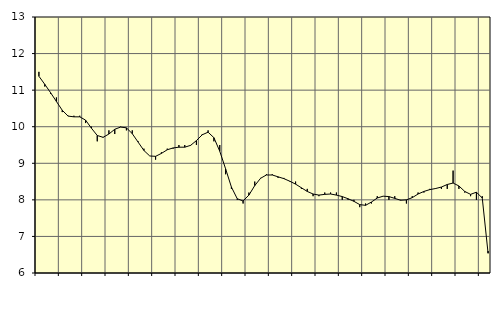
| Category | Piggar | Tillverkning av verkstadsvaror, SNI 25-30, 33 |
|---|---|---|
| nan | 11.5 | 11.38 |
| 1.0 | 11.1 | 11.16 |
| 1.0 | 10.9 | 10.93 |
| 1.0 | 10.8 | 10.69 |
| nan | 10.4 | 10.45 |
| 2.0 | 10.3 | 10.29 |
| 2.0 | 10.3 | 10.27 |
| 2.0 | 10.3 | 10.27 |
| nan | 10.1 | 10.18 |
| 3.0 | 10 | 9.96 |
| 3.0 | 9.6 | 9.76 |
| 3.0 | 9.7 | 9.71 |
| nan | 9.9 | 9.8 |
| 4.0 | 9.8 | 9.93 |
| 4.0 | 10 | 9.99 |
| 4.0 | 9.9 | 9.97 |
| nan | 9.9 | 9.81 |
| 5.0 | 9.6 | 9.58 |
| 5.0 | 9.4 | 9.35 |
| 5.0 | 9.2 | 9.2 |
| nan | 9.1 | 9.19 |
| 6.0 | 9.3 | 9.27 |
| 6.0 | 9.4 | 9.37 |
| 6.0 | 9.4 | 9.42 |
| nan | 9.5 | 9.44 |
| 7.0 | 9.5 | 9.44 |
| 7.0 | 9.5 | 9.49 |
| 7.0 | 9.5 | 9.62 |
| nan | 9.8 | 9.78 |
| 8.0 | 9.9 | 9.85 |
| 8.0 | 9.6 | 9.7 |
| 8.0 | 9.5 | 9.33 |
| nan | 8.7 | 8.85 |
| 9.0 | 8.3 | 8.35 |
| 9.0 | 8 | 8.03 |
| 9.0 | 7.9 | 7.97 |
| nan | 8.2 | 8.13 |
| 10.0 | 8.5 | 8.39 |
| 10.0 | 8.6 | 8.59 |
| 10.0 | 8.7 | 8.68 |
| nan | 8.7 | 8.68 |
| 11.0 | 8.6 | 8.63 |
| 11.0 | 8.6 | 8.58 |
| 11.0 | 8.5 | 8.51 |
| nan | 8.5 | 8.43 |
| 12.0 | 8.3 | 8.33 |
| 12.0 | 8.3 | 8.23 |
| 12.0 | 8.1 | 8.16 |
| nan | 8.1 | 8.13 |
| 13.0 | 8.2 | 8.15 |
| 13.0 | 8.2 | 8.16 |
| 13.0 | 8.2 | 8.13 |
| nan | 8 | 8.09 |
| 14.0 | 8 | 8.03 |
| 14.0 | 8 | 7.96 |
| 14.0 | 7.8 | 7.87 |
| nan | 7.9 | 7.85 |
| 15.0 | 7.9 | 7.94 |
| 15.0 | 8.1 | 8.05 |
| 15.0 | 8.1 | 8.1 |
| nan | 8 | 8.09 |
| 16.0 | 8.1 | 8.04 |
| 16.0 | 8 | 7.99 |
| 16.0 | 7.9 | 8 |
| nan | 8.1 | 8.06 |
| 17.0 | 8.2 | 8.16 |
| 17.0 | 8.2 | 8.23 |
| 17.0 | 8.3 | 8.28 |
| nan | 8.3 | 8.31 |
| 18.0 | 8.3 | 8.35 |
| 18.0 | 8.3 | 8.42 |
| 18.0 | 8.8 | 8.46 |
| nan | 8.3 | 8.38 |
| 19.0 | 8.2 | 8.23 |
| 19.0 | 8.1 | 8.15 |
| 19.0 | 8 | 8.21 |
| nan | 8.1 | 8.05 |
| 20.0 | 6.6 | 6.54 |